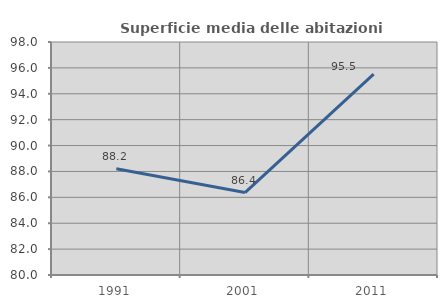
| Category | Superficie media delle abitazioni occupate |
|---|---|
| 1991.0 | 88.204 |
| 2001.0 | 86.371 |
| 2011.0 | 95.514 |